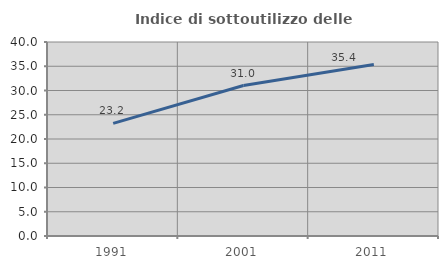
| Category | Indice di sottoutilizzo delle abitazioni  |
|---|---|
| 1991.0 | 23.21 |
| 2001.0 | 31.018 |
| 2011.0 | 35.357 |